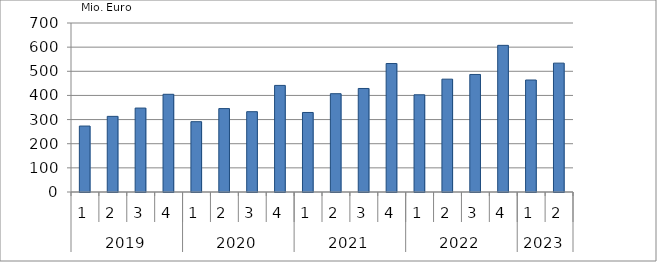
| Category | Ausbaugewerblicher Umsatz3 |
|---|---|
| 0 | 273159.137 |
| 1 | 313254.251 |
| 2 | 347631.281 |
| 3 | 404721.054 |
| 4 | 291272.144 |
| 5 | 345494.215 |
| 6 | 332629.265 |
| 7 | 441463.36 |
| 8 | 329380.212 |
| 9 | 407164.972 |
| 10 | 428783.222 |
| 11 | 532137.089 |
| 12 | 402625.565 |
| 13 | 467398.849 |
| 14 | 486819.26 |
| 15 | 607390.303 |
| 16 | 463895.067 |
| 17 | 533766.53 |